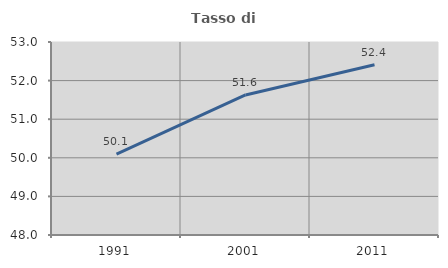
| Category | Tasso di occupazione   |
|---|---|
| 1991.0 | 50.094 |
| 2001.0 | 51.628 |
| 2011.0 | 52.41 |